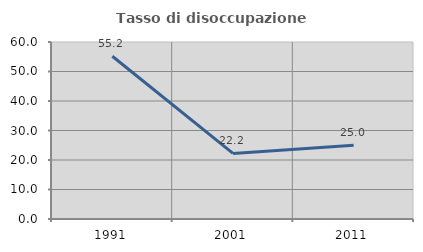
| Category | Tasso di disoccupazione giovanile  |
|---|---|
| 1991.0 | 55.172 |
| 2001.0 | 22.222 |
| 2011.0 | 25 |